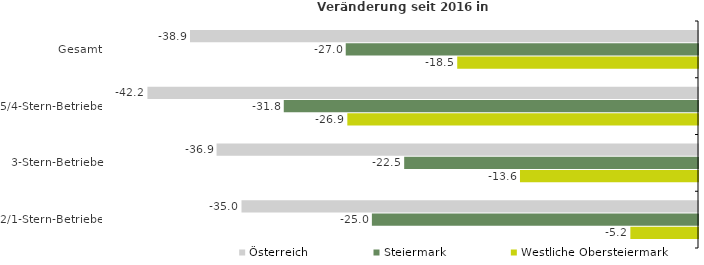
| Category | Österreich | Steiermark | Westliche Obersteiermark |
|---|---|---|---|
| Gesamt | -38.943 | -27.005 | -18.458 |
| 5/4-Stern-Betriebe | -42.206 | -31.755 | -26.882 |
| 3-Stern-Betriebe | -36.907 | -22.524 | -13.647 |
| 2/1-Stern-Betriebe | -34.996 | -25 | -5.185 |